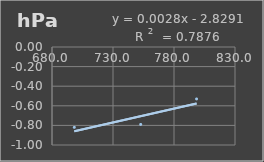
| Category | Presión Admosferica |
|---|---|
| 698.3 | -0.82 |
| 752.7 | -0.79 |
| 798.5 | -0.53 |